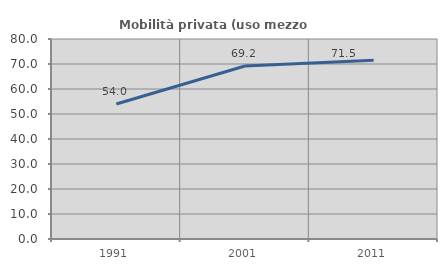
| Category | Mobilità privata (uso mezzo privato) |
|---|---|
| 1991.0 | 54.006 |
| 2001.0 | 69.208 |
| 2011.0 | 71.533 |